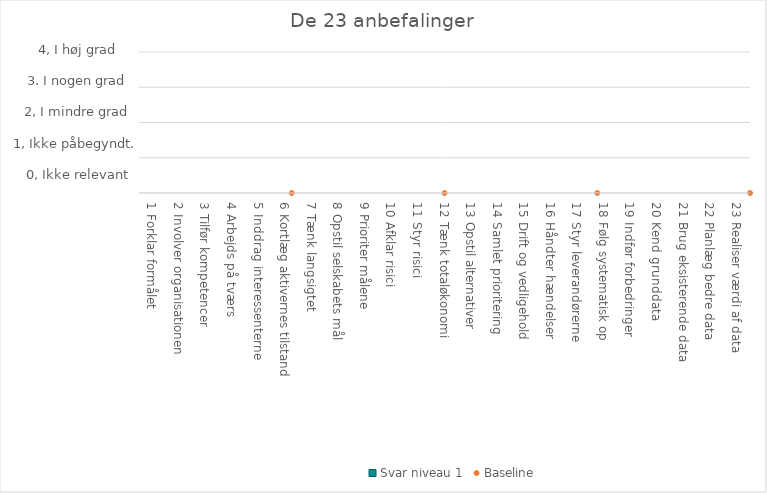
| Category | Svar niveau 1 |
|---|---|
| 1 Forklar formålet | 0 |
| 2 Involver organisationen | 0 |
| 3 Tilfør kompetencer | 0 |
| 4 Arbejds på tværs | 0 |
| 5 Inddrag interessenterne | 0 |
| 6 Kortlæg aktivernes tilstand | 0 |
| 7 Tænk langsigtet | 0 |
| 8 Opstil selskabets mål | 0 |
| 9 Prioriter målene | 0 |
| 10 Afklar risici | 0 |
| 11 Styr risici | 0 |
| 12 Tænk totaløkonomi  | 0 |
| 13 Opstil alternativer | 0 |
| 14 Samlet prioritering | 0 |
| 15 Drift og vedligehold  | 0 |
| 16 Håndter hændelser | 0 |
| 17 Styr leverandørerne | 0 |
| 18 Følg systematisk op | 0 |
| 19 Indfør forbedringer | 0 |
| 20 Kend grunddata | 0 |
| 21 Brug eksisterende data | 0 |
| 22 Planlæg bedre data | 0 |
| 23 Realiser værdi af data | 0 |